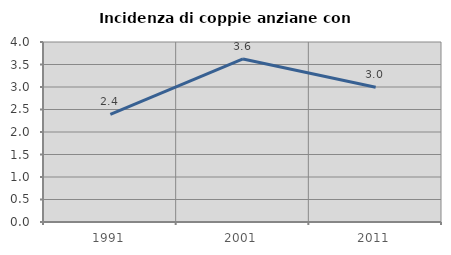
| Category | Incidenza di coppie anziane con figli |
|---|---|
| 1991.0 | 2.392 |
| 2001.0 | 3.623 |
| 2011.0 | 2.993 |